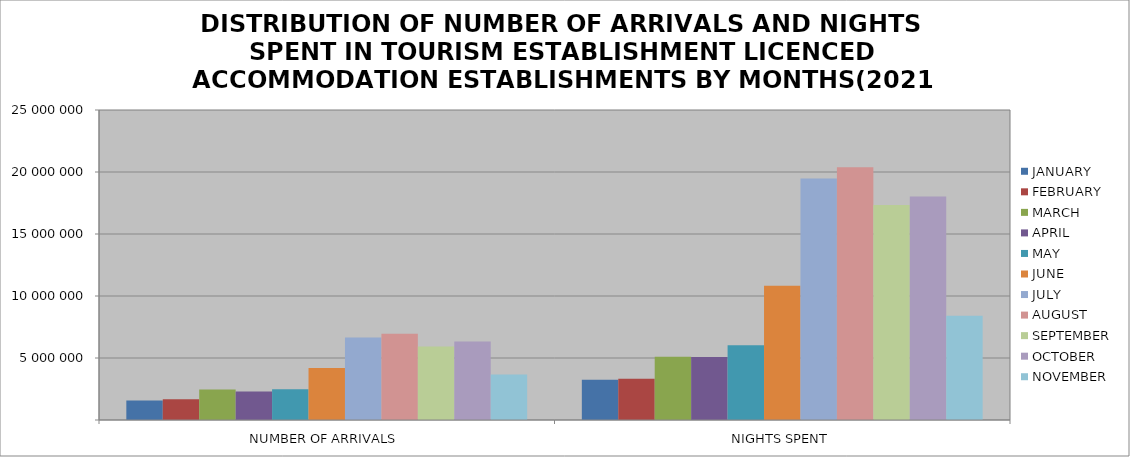
| Category | JANUARY | FEBRUARY | MARCH | APRIL | MAY | JUNE | JULY | AUGUST | SEPTEMBER | OCTOBER | NOVEMBER |
|---|---|---|---|---|---|---|---|---|---|---|---|
| NUMBER OF ARRIVALS | 1571594 | 1670164 | 2462715 | 2305703 | 2480312 | 4203299 | 6647723 | 6953153 | 5925169 | 6333100 | 3670952 |
| NIGHTS SPENT | 3239980 | 3333484 | 5094921 | 5081446 | 6019981 | 10819754 | 19475865 | 20388962 | 17330893 | 18033301 | 8403355 |